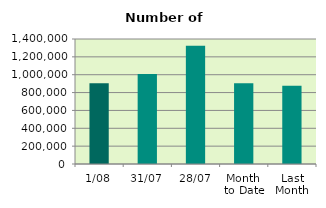
| Category | Series 0 |
|---|---|
| 1/08 | 903192 |
| 31/07 | 1007852 |
| 28/07 | 1323044 |
| Month 
to Date | 903192 |
| Last
Month | 877151.619 |